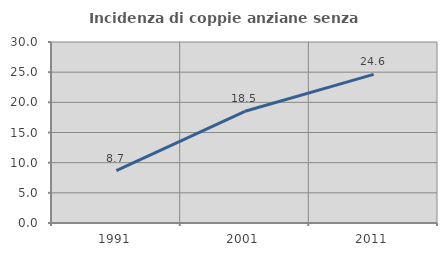
| Category | Incidenza di coppie anziane senza figli  |
|---|---|
| 1991.0 | 8.696 |
| 2001.0 | 18.519 |
| 2011.0 | 24.638 |